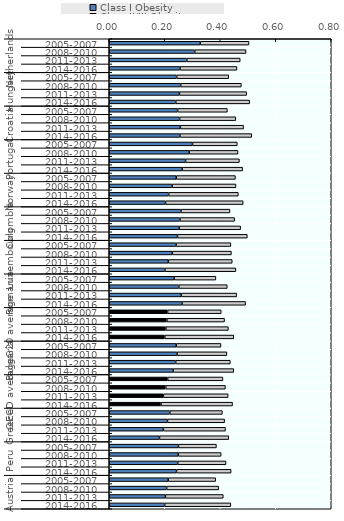
| Category | Class I Obesity | Class II/III Obesity |
|---|---|---|
| 0 | 0.328 | 0.176 |
| 1 | 0.308 | 0.185 |
| 2 | 0.28 | 0.192 |
| 3 | 0.255 | 0.205 |
| 4 | 0.243 | 0.188 |
| 5 | 0.258 | 0.218 |
| 6 | 0.253 | 0.242 |
| 7 | 0.24 | 0.266 |
| 8 | 0.246 | 0.179 |
| 9 | 0.254 | 0.202 |
| 10 | 0.256 | 0.228 |
| 11 | 0.255 | 0.259 |
| 12 | 0.3 | 0.161 |
| 13 | 0.288 | 0.176 |
| 14 | 0.275 | 0.194 |
| 15 | 0.263 | 0.218 |
| 16 | 0.241 | 0.213 |
| 17 | 0.227 | 0.23 |
| 18 | 0.214 | 0.251 |
| 19 | 0.203 | 0.28 |
| 20 | 0.258 | 0.177 |
| 21 | 0.255 | 0.197 |
| 22 | 0.252 | 0.222 |
| 23 | 0.246 | 0.252 |
| 24 | 0.241 | 0.197 |
| 25 | 0.227 | 0.213 |
| 26 | 0.213 | 0.23 |
| 27 | 0.201 | 0.256 |
| 28 | 0.234 | 0.15 |
| 29 | 0.251 | 0.175 |
| 30 | 0.26 | 0.2 |
| 31 | 0.262 | 0.229 |
| 32 | 0.21 | 0.193 |
| 33 | 0.208 | 0.208 |
| 34 | 0.204 | 0.225 |
| 35 | 0.2 | 0.248 |
| 36 | 0.241 | 0.161 |
| 37 | 0.244 | 0.179 |
| 38 | 0.239 | 0.197 |
| 39 | 0.23 | 0.218 |
| 40 | 0.21 | 0.199 |
| 41 | 0.204 | 0.215 |
| 42 | 0.195 | 0.233 |
| 43 | 0.187 | 0.258 |
| 44 | 0.218 | 0.19 |
| 45 | 0.21 | 0.206 |
| 46 | 0.195 | 0.224 |
| 47 | 0.181 | 0.25 |
| 48 | 0.249 | 0.137 |
| 49 | 0.249 | 0.154 |
| 50 | 0.247 | 0.174 |
| 51 | 0.242 | 0.197 |
| 52 | 0.212 | 0.171 |
| 53 | 0.207 | 0.187 |
| 54 | 0.202 | 0.209 |
| 55 | 0.2 | 0.238 |